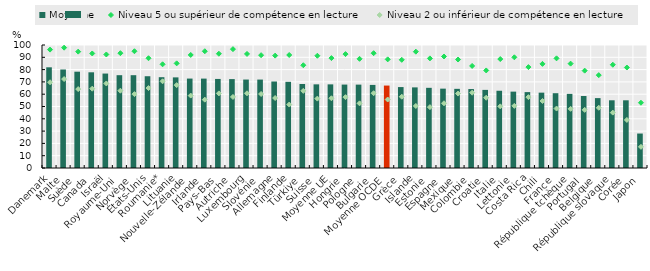
| Category | Moyenne |
|---|---|
| Danemark | 81.867 |
| Malte | 80.09 |
| Suède | 78.302 |
| Canada | 77.804 |
| Israël | 76.783 |
| Royaume­Uni | 75.461 |
| Norvège | 75.459 |
| États­Unis | 74.615 |
| Roumanie* | 73.827 |
| Lituanie | 73.675 |
| Nouvelle­Zélande | 72.707 |
| Irlande | 72.681 |
| Pays­Bas | 72.408 |
| Autriche | 72.278 |
| Luxembourg | 71.913 |
| Slovénie | 71.894 |
| Allemagne | 70.326 |
| Finlande | 70.068 |
| Türkiye | 68.308 |
| Suisse | 68.01 |
| Moyenne UE | 67.994 |
| Hongrie | 67.822 |
| Pologne | 67.79 |
| Bulgarie | 67.548 |
| Moyenne OCDE | 67.019 |
| Grèce | 65.795 |
| Islande | 65.543 |
| Estonie | 65.184 |
| Espagne | 64.517 |
| Mexique | 64.358 |
| Colombie | 64.177 |
| Croatie | 63.504 |
| Italie | 62.805 |
| Lettonie | 62.09 |
| Costa Rica | 61.703 |
| Chili | 61.265 |
| France | 60.816 |
| République tchèque | 60.261 |
| Portugal | 58.53 |
| Belgique | 56.82 |
| République slovaque | 55.047 |
| Corée | 55.04 |
| Japon | 28.019 |